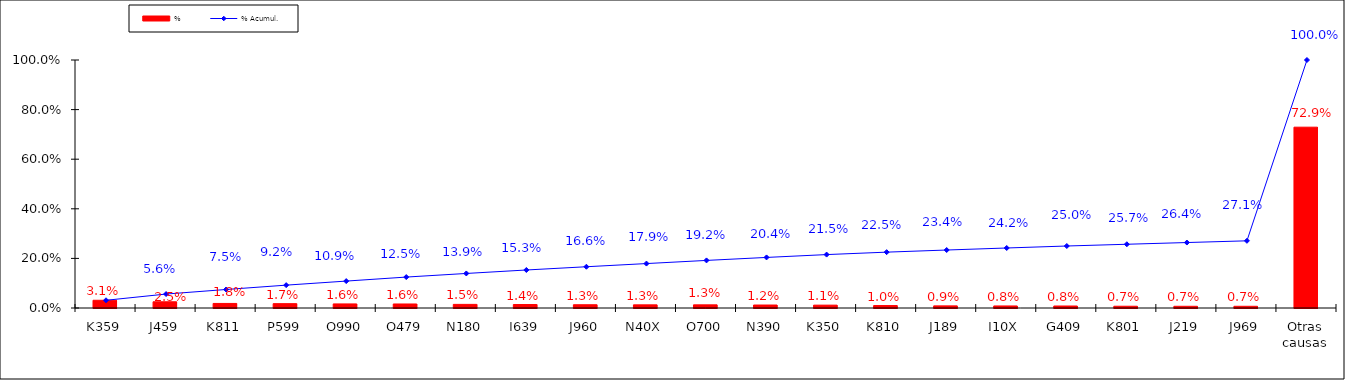
| Category | % |
|---|---|
| K359 | 0.031 |
| J459 | 0.025 |
| K811 | 0.018 |
| P599 | 0.017 |
| O990 | 0.016 |
| O479 | 0.016 |
| N180 | 0.015 |
| I639 | 0.014 |
| J960 | 0.013 |
| N40X | 0.013 |
| O700 | 0.013 |
| N390 | 0.012 |
| K350 | 0.011 |
| K810 | 0.01 |
| J189 | 0.009 |
| I10X | 0.008 |
| G409 | 0.008 |
| K801 | 0.007 |
| J219 | 0.007 |
| J969 | 0.007 |
| Otras causas | 0.729 |